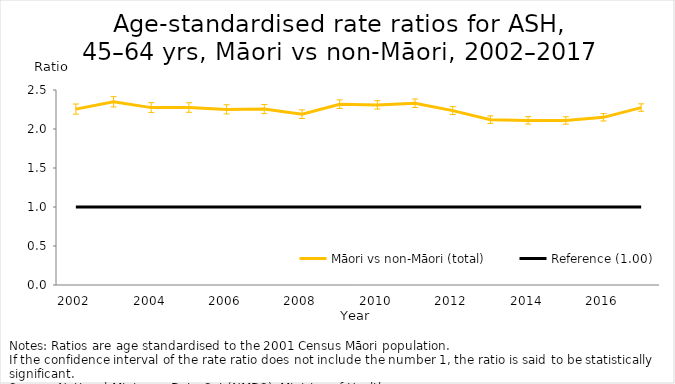
| Category | Māori vs non-Māori (total) | Reference (1.00) |
|---|---|---|
| 2002.0 | 2.255 | 1 |
| 2003.0 | 2.348 | 1 |
| 2004.0 | 2.274 | 1 |
| 2005.0 | 2.275 | 1 |
| 2006.0 | 2.251 | 1 |
| 2007.0 | 2.255 | 1 |
| 2008.0 | 2.19 | 1 |
| 2009.0 | 2.318 | 1 |
| 2010.0 | 2.309 | 1 |
| 2011.0 | 2.329 | 1 |
| 2012.0 | 2.236 | 1 |
| 2013.0 | 2.119 | 1 |
| 2014.0 | 2.11 | 1 |
| 2015.0 | 2.109 | 1 |
| 2016.0 | 2.15 | 1 |
| 2017.0 | 2.274 | 1 |